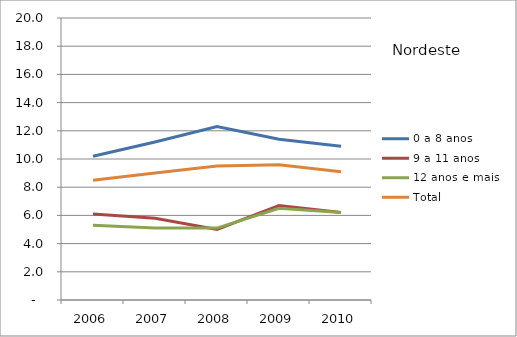
| Category | 0 a 8 anos | 9 a 11 anos | 12 anos e mais | Total |
|---|---|---|---|---|
| 2006.0 | 10.2 | 6.1 | 5.3 | 8.5 |
| 2007.0 | 11.2 | 5.8 | 5.1 | 9 |
| 2008.0 | 12.3 | 5 | 5.1 | 9.5 |
| 2009.0 | 11.4 | 6.7 | 6.5 | 9.6 |
| 2010.0 | 10.9 | 6.2 | 6.2 | 9.1 |